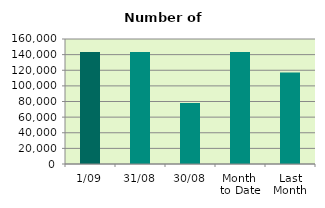
| Category | Series 0 |
|---|---|
| 1/09 | 143484 |
| 31/08 | 143496 |
| 30/08 | 78010 |
| Month 
to Date | 143484 |
| Last
Month | 117090.273 |